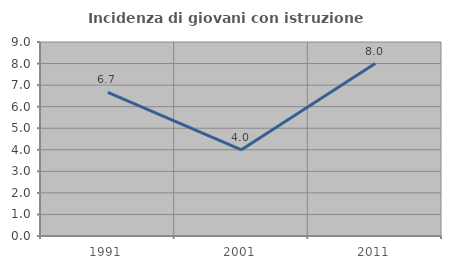
| Category | Incidenza di giovani con istruzione universitaria |
|---|---|
| 1991.0 | 6.667 |
| 2001.0 | 4 |
| 2011.0 | 8 |